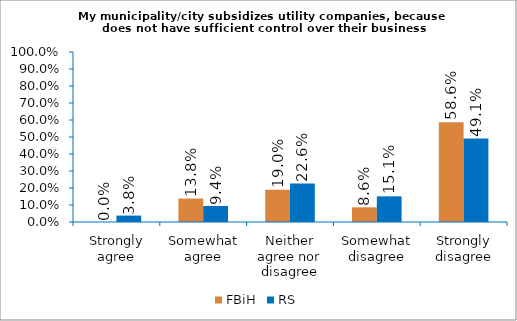
| Category | FBiH | RS |
|---|---|---|
| Strongly agree | 0 | 0.038 |
| Somewhat agree | 0.138 | 0.094 |
| Neither agree nor disagree | 0.19 | 0.226 |
| Somewhat disagree | 0.086 | 0.151 |
| Strongly disagree | 0.586 | 0.491 |